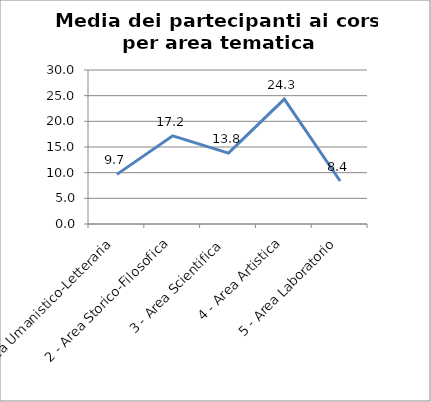
| Category | Media dei partecipanti ai corsi |
|---|---|
| 1 - Area Umanistico-Letteraria | 9.667 |
| 2 - Area Storico-Filosofica | 17.167 |
| 3 - Area Scientifica | 13.8 |
| 4 - Area Artistica | 24.333 |
| 5 - Area Laboratorio | 8.375 |